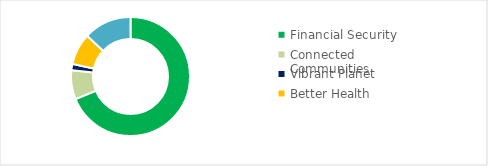
| Category | Series 0 |
|---|---|
| Financial Security | 0.688 |
| Connected Communities | 0.079 |
| Vibrant Planet | 0.017 |
| Better Health | 0.086 |
| Other | 0.13 |